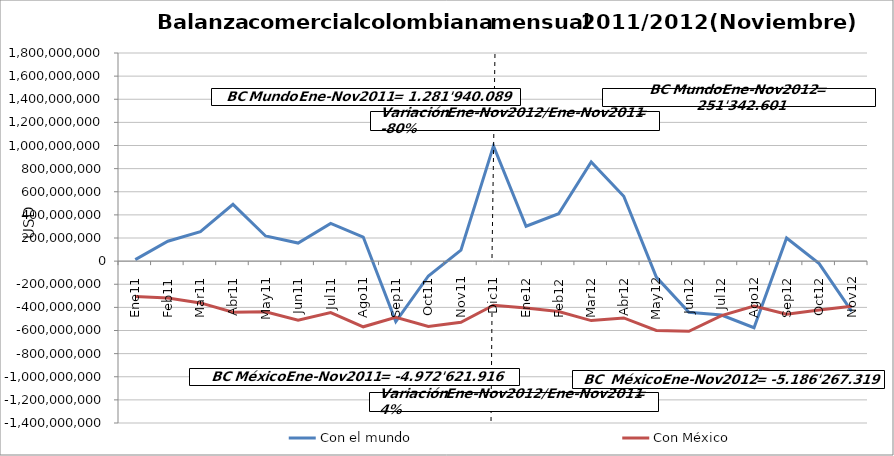
| Category | Con el mundo | Con México |
|---|---|---|
| 0 | 12976228.07 | -305427964.75 |
| 1 | 172080876.66 | -319484859.84 |
| 2 | 254737279.24 | -361230033.66 |
| 3 | 491095442.31 | -442499290.64 |
| 4 | 217317087.62 | -437991349.56 |
| 5 | 156393086.3 | -511002335.12 |
| 6 | 326134966.39 | -445643223.1 |
| 7 | 208345592.97 | -567943976.1 |
| 8 | -522891907.61 | -486779554.13 |
| 9 | -128564369.04 | -565466205.69 |
| 10 | 94315805.83 | -529153123.16 |
| 11 | 996753832.74 | -381467029.64 |
| 12 | 301773207.39 | -406176505.17 |
| 13 | 410189041.25 | -435757788.76 |
| 14 | 857833423.7 | -514353338.37 |
| 15 | 561075382.57 | -491316278 |
| 16 | -138077862.03 | -599231381.76 |
| 17 | -442796860.29 | -606803782.43 |
| 18 | -466144859.55 | -470562735.2 |
| 19 | -576040883.11 | -389408745.85 |
| 20 | 199786607.19 | -459469037.14 |
| 21 | -21809707.87 | -423241997.84 |
| 22 | -434444888.54 | -389945728.69 |